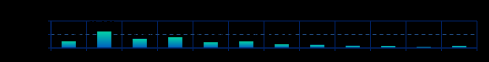
| Category | Series 0 |
|---|---|
| Mar 15 | 24756 |
| Jun 15 | 61151 |
| Sep 15 | 34284 |
| Dec 15 | 39976 |
| Mar 16 | 21394 |
| Jun 16 | 24532 |
| Sep 16 | 13936 |
| Dec 16 | 12128 |
| Mar 17 | 8540 |
| Jun 17 | 7648 |
| Sep 17 | 4491 |
| Dec 17 | 7876 |